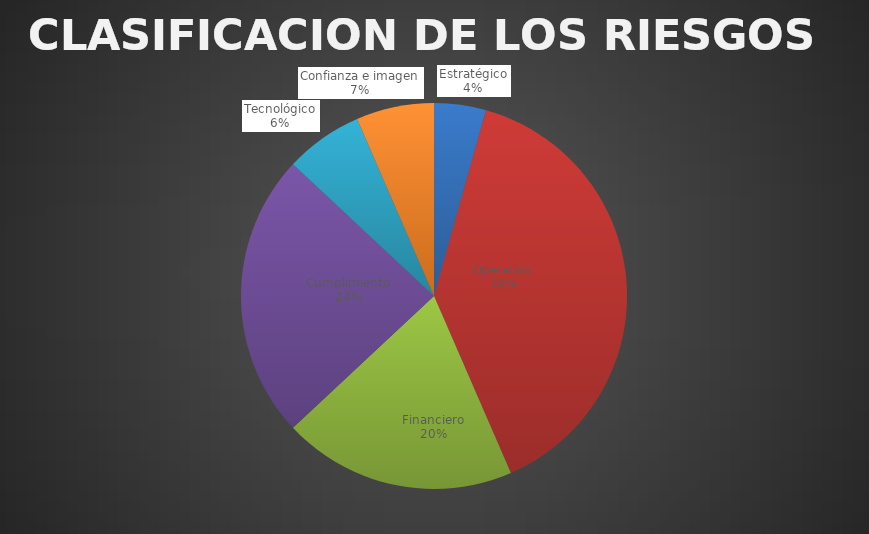
| Category | Series 0 |
|---|---|
| Estratégico | 2 |
| Operativo | 18 |
| Financiero | 9 |
| Cumplimiento | 11 |
| Tecnológico | 3 |
| Confianza e imagen | 3 |